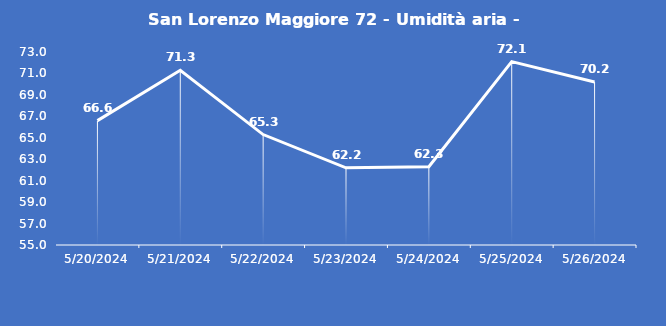
| Category | San Lorenzo Maggiore 72 - Umidità aria - Grezzo (%) |
|---|---|
| 5/20/24 | 66.6 |
| 5/21/24 | 71.3 |
| 5/22/24 | 65.3 |
| 5/23/24 | 62.2 |
| 5/24/24 | 62.3 |
| 5/25/24 | 72.1 |
| 5/26/24 | 70.2 |